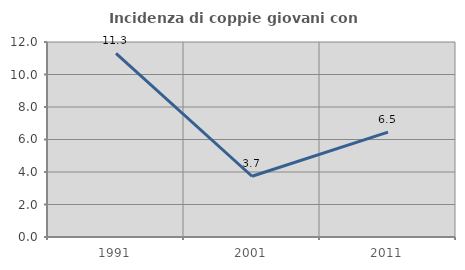
| Category | Incidenza di coppie giovani con figli |
|---|---|
| 1991.0 | 11.304 |
| 2001.0 | 3.738 |
| 2011.0 | 6.452 |